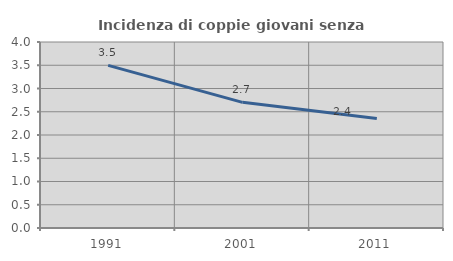
| Category | Incidenza di coppie giovani senza figli |
|---|---|
| 1991.0 | 3.497 |
| 2001.0 | 2.703 |
| 2011.0 | 2.353 |